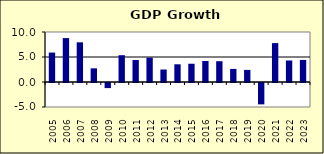
| Category | 6.4 |
|---|---|
| 2005.0 | 5.886 |
| 2006.0 | 8.78 |
| 2007.0 | 7.935 |
| 2008.0 | 2.732 |
| 2009.0 | -1.016 |
| 2010.0 | 5.36 |
| 2011.0 | 4.403 |
| 2012.0 | 4.883 |
| 2013.0 | 2.495 |
| 2014.0 | 3.542 |
| 2015.0 | 3.652 |
| 2016.0 | 4.204 |
| 2017.0 | 4.158 |
| 2018.0 | 2.616 |
| 2019.0 | 2.418 |
| 2020.0 | -4.273 |
| 2021.0 | 7.781 |
| 2022.0 | 4.305 |
| 2023.0 | 4.415 |